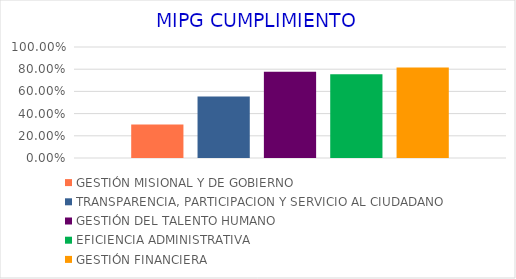
| Category | GESTIÓN MISIONAL Y DE GOBIERNO | TRANSPARENCIA, PARTICIPACION Y SERVICIO AL CIUDADANO | GESTIÓN DEL TALENTO HUMANO | EFICIENCIA ADMINISTRATIVA | GESTIÓN FINANCIERA |
|---|---|---|---|---|---|
| 0 | 0.302 | 0.555 | 0.776 | 0.755 | 0.816 |